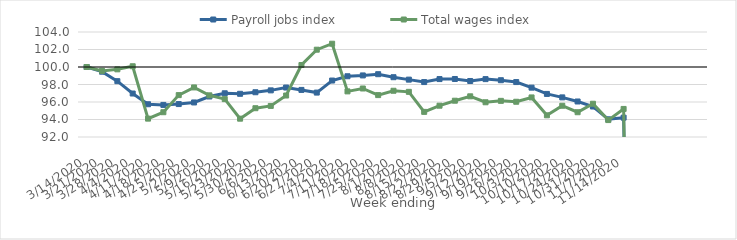
| Category | Payroll jobs index | Total wages index |
|---|---|---|
| 14/03/2020 | 100 | 100 |
| 21/03/2020 | 99.465 | 99.558 |
| 28/03/2020 | 98.382 | 99.732 |
| 04/04/2020 | 96.969 | 100.084 |
| 11/04/2020 | 95.744 | 94.099 |
| 18/04/2020 | 95.667 | 94.833 |
| 25/04/2020 | 95.764 | 96.787 |
| 02/05/2020 | 95.948 | 97.666 |
| 09/05/2020 | 96.63 | 96.762 |
| 16/05/2020 | 96.997 | 96.327 |
| 23/05/2020 | 96.937 | 94.094 |
| 30/05/2020 | 97.115 | 95.29 |
| 06/06/2020 | 97.33 | 95.553 |
| 13/06/2020 | 97.653 | 96.741 |
| 20/06/2020 | 97.381 | 100.227 |
| 27/06/2020 | 97.076 | 101.978 |
| 04/07/2020 | 98.452 | 102.66 |
| 11/07/2020 | 98.942 | 97.213 |
| 18/07/2020 | 99.037 | 97.543 |
| 25/07/2020 | 99.177 | 96.788 |
| 01/08/2020 | 98.832 | 97.284 |
| 08/08/2020 | 98.556 | 97.161 |
| 15/08/2020 | 98.278 | 94.872 |
| 22/08/2020 | 98.62 | 95.578 |
| 29/08/2020 | 98.629 | 96.147 |
| 05/09/2020 | 98.401 | 96.65 |
| 12/09/2020 | 98.616 | 95.969 |
| 19/09/2020 | 98.491 | 96.13 |
| 26/09/2020 | 98.278 | 96.028 |
| 03/10/2020 | 97.64 | 96.522 |
| 10/10/2020 | 96.923 | 94.48 |
| 17/10/2020 | 96.528 | 95.572 |
| 24/10/2020 | 96.057 | 94.832 |
| 31/10/2020 | 95.485 | 95.802 |
| 07/11/2020 | 94.022 | 93.932 |
| 14/11/2020 | 94.211 | 95.208 |